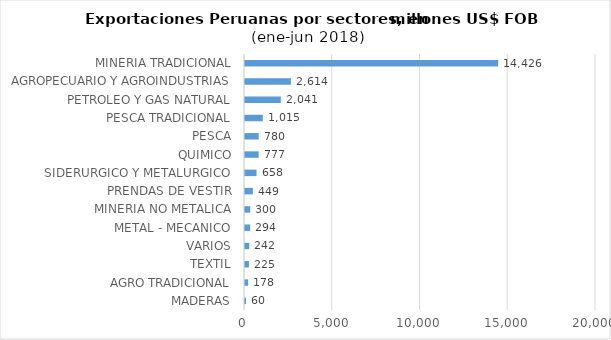
| Category | Series 0 |
|---|---|
| MADERAS | 60.175 |
| AGRO TRADICIONAL | 177.886 |
| TEXTIL | 225.361 |
| VARIOS | 242.431 |
| METAL - MECANICO | 293.575 |
| MINERIA NO METALICA | 299.771 |
| PRENDAS DE VESTIR | 448.744 |
| SIDERURGICO Y METALURGICO | 658.016 |
| QUIMICO | 776.697 |
| PESCA | 779.997 |
| PESCA TRADICIONAL | 1015.083 |
| PETROLEO Y GAS NATURAL | 2040.586 |
| AGROPECUARIO Y AGROINDUSTRIAS | 2614.006 |
| MINERIA TRADICIONAL | 14426.311 |